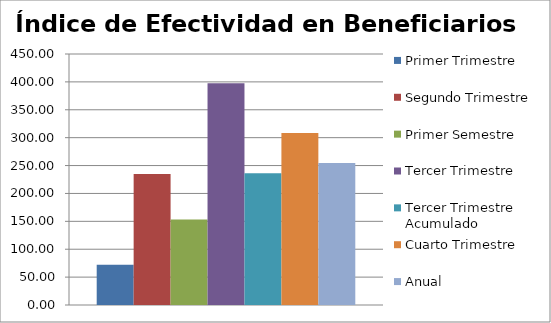
| Category | Primer Trimestre | Segundo Trimestre | Primer Semestre | Tercer Trimestre | Tercer Trimestre Acumulado | Cuarto Trimestre | Anual |
|---|---|---|---|---|---|---|---|
| 0 | 72.064 | 234.729 | 153.396 | 397.422 | 236.356 | 308.208 | 254.564 |